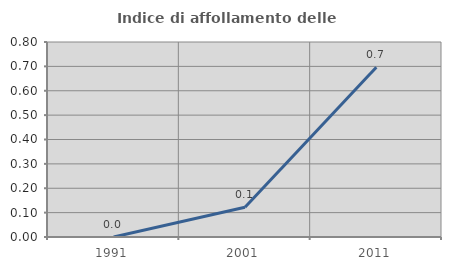
| Category | Indice di affollamento delle abitazioni  |
|---|---|
| 1991.0 | 0 |
| 2001.0 | 0.122 |
| 2011.0 | 0.696 |